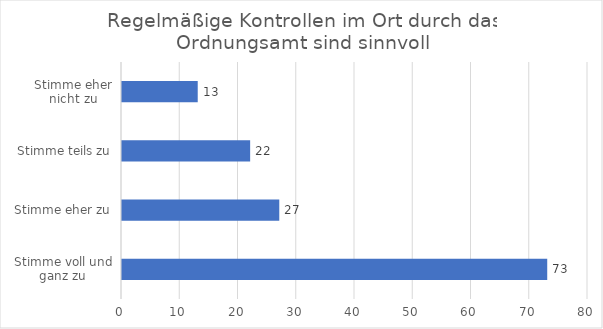
| Category | Series 0 |
|---|---|
| Stimme voll und ganz zu | 73 |
| Stimme eher zu | 27 |
| Stimme teils zu | 22 |
| Stimme eher nicht zu | 13 |